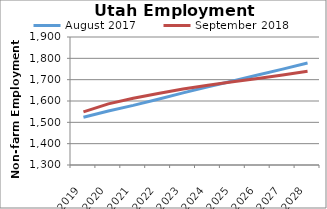
| Category | August 2017 | September 2018 |
|---|---|---|
| 2019.0 | 1523.984 | 1548.945 |
| 2020.0 | 1553.138 | 1586.602 |
| 2021.0 | 1579.318 | 1612.533 |
| 2022.0 | 1608.343 | 1635.417 |
| 2023.0 | 1638.147 | 1655.87 |
| 2024.0 | 1666.469 | 1674.284 |
| 2025.0 | 1694.012 | 1690.202 |
| 2026.0 | 1721.498 | 1705.685 |
| 2027.0 | 1749.561 | 1722.192 |
| 2028.0 | 1778.109 | 1739.23 |